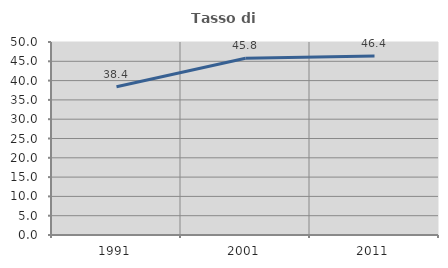
| Category | Tasso di occupazione   |
|---|---|
| 1991.0 | 38.398 |
| 2001.0 | 45.813 |
| 2011.0 | 46.396 |